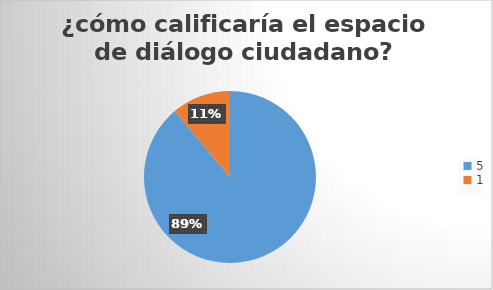
| Category | Series 0 |
|---|---|
| 5.0 | 8 |
| 1.0 | 1 |